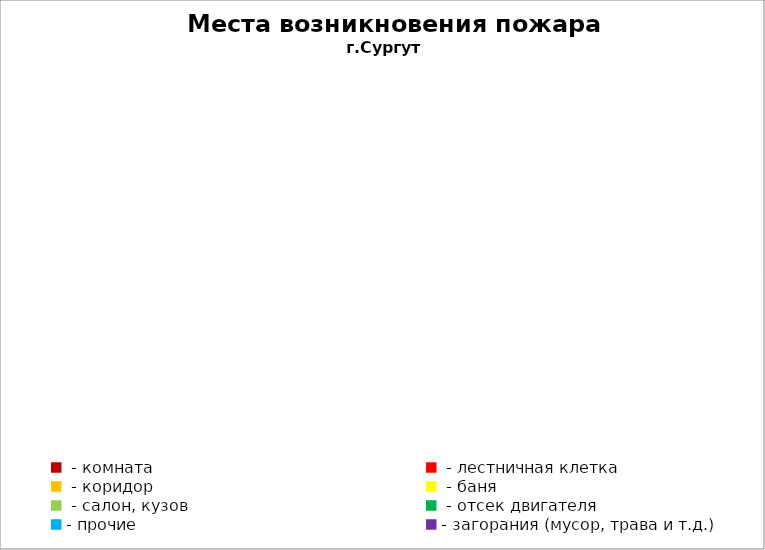
| Category | Места возникновения пожара |
|---|---|
|  - комната | 11 |
|  - лестничная клетка | 2 |
|  - коридор | 0 |
|  - баня | 0 |
|  - салон, кузов | 1 |
|  - отсек двигателя | 1 |
| - прочие | 7 |
| - загорания (мусор, трава и т.д.)  | 8 |